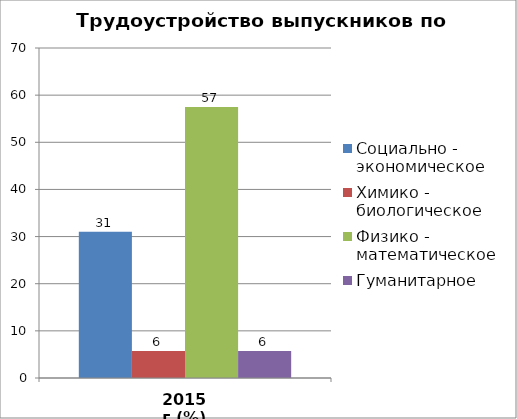
| Category | Социально - экономическое | Химико - биологическое | Физико - математическое | Гуманитарное |
|---|---|---|---|---|
| 2015 г.(%) | 31.034 | 5.747 | 57.471 | 5.747 |